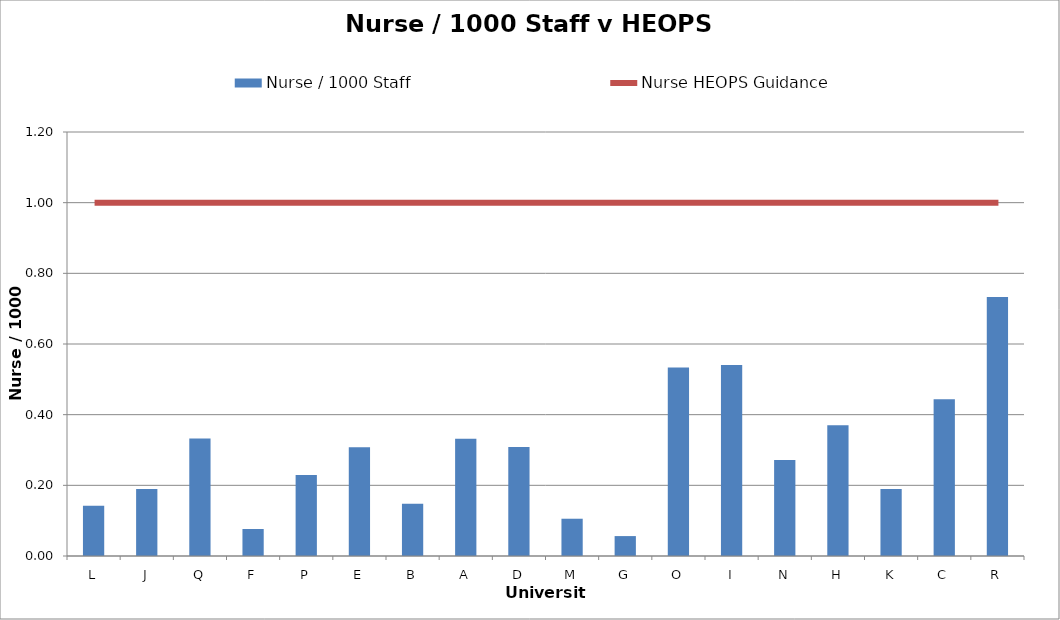
| Category | Nurse / 1000 Staff  |
|---|---|
| L | 0.142 |
| J | 0.189 |
| Q | 0.333 |
| F | 0.076 |
| P | 0.229 |
| E | 0.308 |
| B | 0.148 |
| A | 0.332 |
| D | 0.308 |
| M | 0.105 |
| G | 0.056 |
| O | 0.533 |
| I | 0.541 |
| N | 0.272 |
| H | 0.37 |
| K | 0.19 |
| C | 0.444 |
| R | 0.733 |